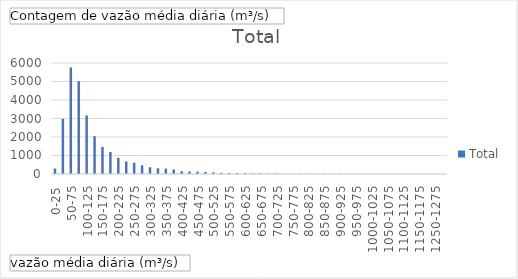
| Category | Total |
|---|---|
| 0-25 | 297 |
| 25-50 | 2983 |
| 50-75 | 5757 |
| 75-100 | 5016 |
| 100-125 | 3167 |
| 125-150 | 2045 |
| 150-175 | 1467 |
| 175-200 | 1186 |
| 200-225 | 877 |
| 225-250 | 680 |
| 250-275 | 607 |
| 275-300 | 472 |
| 300-325 | 364 |
| 325-350 | 309 |
| 350-375 | 291 |
| 375-400 | 243 |
| 400-425 | 151 |
| 425-450 | 137 |
| 450-475 | 127 |
| 475-500 | 111 |
| 500-525 | 92 |
| 525-550 | 63 |
| 550-575 | 53 |
| 575-600 | 50 |
| 600-625 | 46 |
| 625-650 | 35 |
| 650-675 | 35 |
| 675-700 | 26 |
| 700-725 | 29 |
| 725-750 | 14 |
| 750-775 | 13 |
| 775-800 | 11 |
| 800-825 | 18 |
| 825-850 | 8 |
| 850-875 | 9 |
| 875-900 | 8 |
| 900-925 | 10 |
| 925-950 | 6 |
| 950-975 | 6 |
| 975-1000 | 3 |
| 1000-1025 | 4 |
| 1025-1050 | 3 |
| 1050-1075 | 1 |
| 1075-1100 | 4 |
| 1100-1125 | 4 |
| 1125-1150 | 5 |
| 1150-1175 | 2 |
| 1200-1225 | 1 |
| 1250-1275 | 1 |
| 1400-1425 | 1 |